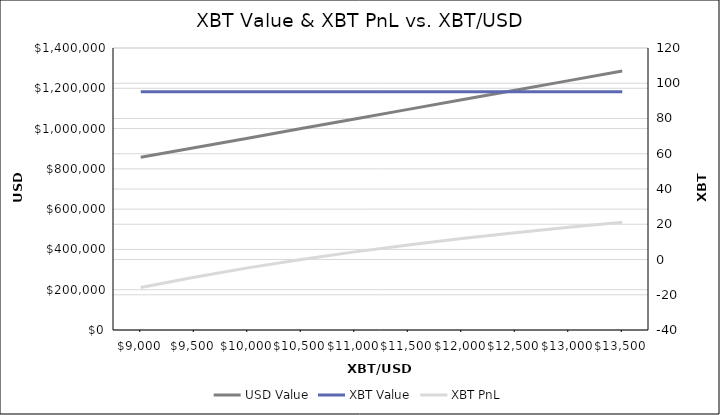
| Category | USD Value |
|---|---|
| 9000.0 | 857142.857 |
| 9500.0 | 904761.905 |
| 10000.0 | 952380.952 |
| 10500.0 | 1000000 |
| 11000.0 | 1047619.048 |
| 11500.0 | 1095238.095 |
| 12000.0 | 1142857.143 |
| 12500.0 | 1190476.19 |
| 13000.0 | 1238095.238 |
| 13500.0 | 1285714.286 |